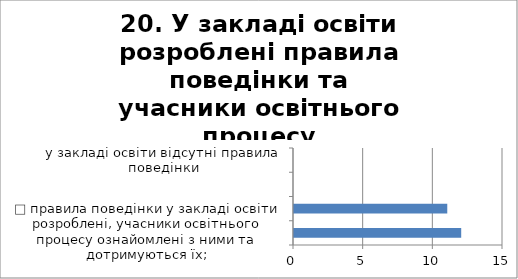
| Category | 20. У закладі освіти розроблені правила поведінки та учасники освітнього процесу дотримуються їх? |
|---|---|
| □ правила поведінки у закладі освіти розроблені, учасники освітнього процесу ознайомлені з ними та дотримуються їх; | 12 |
| □    правила поведінки у закладі освіти розроблені, учасники освітнього процесу ознайомлені з ними, але не завжди дотримуються їх; | 11 |
| □    правила поведінки у закладі освіти розроблені, учасники освітнього процесу ознайомлені з ними, але не завжди дотримуються їх; | 0 |
| у закладі освіти відсутні правила поведінки | 0 |